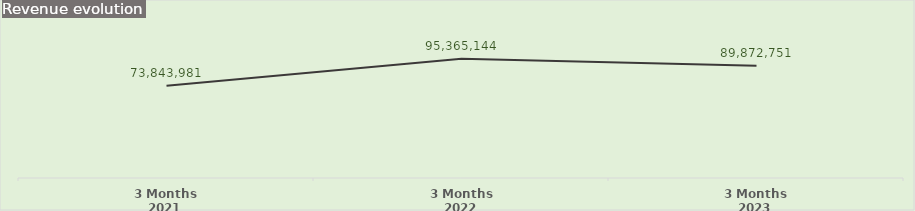
| Category | Series 1 |
|---|---|
| 3 Months 2021 | 73843980.703 |
| 3 Months 2022 | 95365144.089 |
| 3 Months 2023 | 89872750.66 |